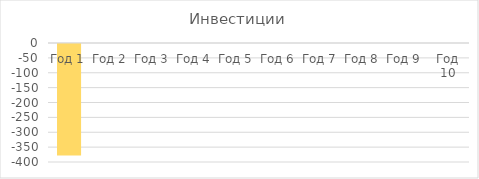
| Category | Инвестиции |
|---|---|
| Год 1 | -375 |
| Год 2 | 0 |
| Год 3 | 0 |
| Год 4 | 0 |
| Год 5 | 0 |
| Год 6 | 0 |
| Год 7 | 0 |
| Год 8 | 0 |
| Год 9 | 0 |
| Год 10 | 0 |